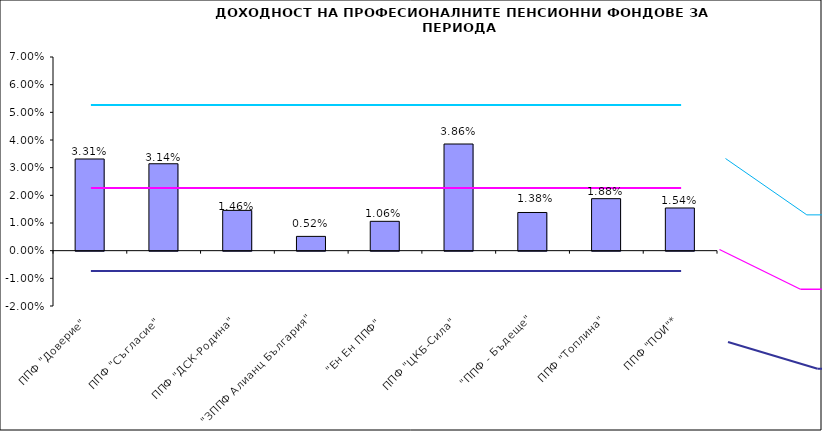
| Category | Series 0 |
|---|---|
| ППФ "Доверие"  | 0.033 |
| ППФ "Съгласие"  | 0.031 |
| ППФ "ДСК-Родина"  | 0.015 |
| "ЗППФ Алианц България"  | 0.005 |
| "Ен Ен ППФ"  | 0.011 |
| ППФ "ЦКБ-Сила"  | 0.039 |
| "ППФ - Бъдеще" | 0.014 |
| ППФ "Топлина" | 0.019 |
| ППФ "ПОИ"* | 0.015 |